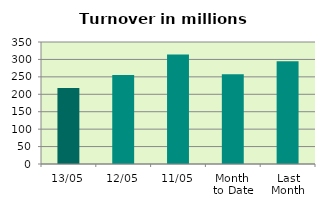
| Category | Series 0 |
|---|---|
| 13/05 | 217.829 |
| 12/05 | 255.449 |
| 11/05 | 314.433 |
| Month 
to Date | 257.683 |
| Last
Month | 294.539 |